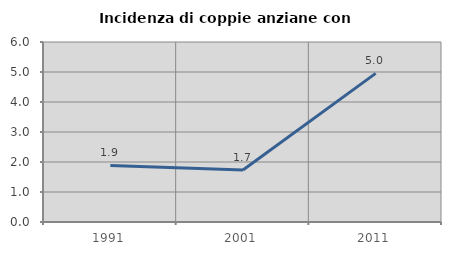
| Category | Incidenza di coppie anziane con figli |
|---|---|
| 1991.0 | 1.887 |
| 2001.0 | 1.732 |
| 2011.0 | 4.955 |